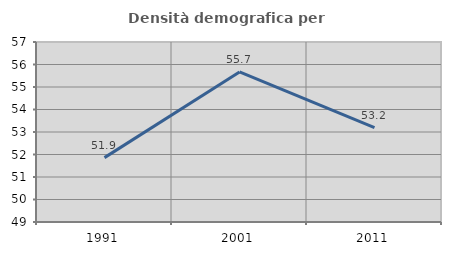
| Category | Densità demografica |
|---|---|
| 1991.0 | 51.861 |
| 2001.0 | 55.669 |
| 2011.0 | 53.191 |